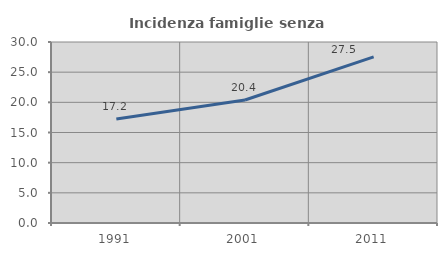
| Category | Incidenza famiglie senza nuclei |
|---|---|
| 1991.0 | 17.226 |
| 2001.0 | 20.381 |
| 2011.0 | 27.544 |